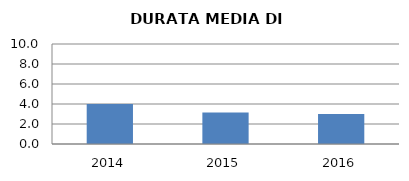
| Category | 2014 2015 2016 |
|---|---|
| 2014.0 | 4 |
| 2015.0 | 3.143 |
| 2016.0 | 3 |